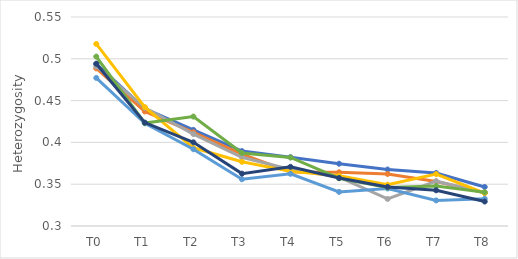
| Category | H1 | H2 | H3 | H4 | H5 | H6 | H7 |
|---|---|---|---|---|---|---|---|
| T0 | 0.494 | 0.489 | 0.491 | 0.518 | 0.477 | 0.503 | 0.494 |
| T1 | 0.44 | 0.437 | 0.441 | 0.442 | 0.423 | 0.423 | 0.424 |
| T2 | 0.415 | 0.412 | 0.41 | 0.394 | 0.392 | 0.431 | 0.4 |
| T3 | 0.39 | 0.386 | 0.382 | 0.377 | 0.356 | 0.387 | 0.363 |
| T4 | 0.382 | 0.365 | 0.367 | 0.365 | 0.362 | 0.382 | 0.371 |
| T5 | 0.374 | 0.364 | 0.359 | 0.36 | 0.341 | 0.357 | 0.357 |
| T6 | 0.368 | 0.362 | 0.332 | 0.349 | 0.345 | 0.346 | 0.347 |
| T7 | 0.363 | 0.353 | 0.354 | 0.362 | 0.331 | 0.348 | 0.343 |
| T8 | 0.347 | 0.34 | 0.34 | 0.339 | 0.333 | 0.34 | 0.329 |